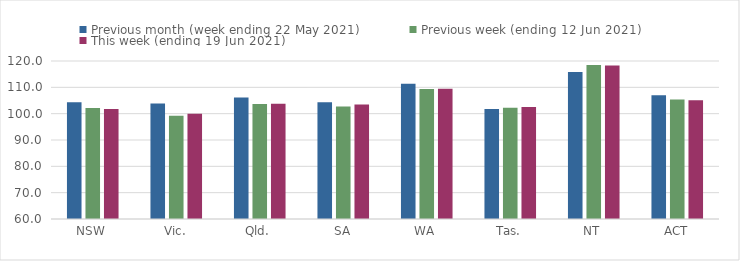
| Category | Previous month (week ending 22 May 2021) | Previous week (ending 12 Jun 2021) | This week (ending 19 Jun 2021) |
|---|---|---|---|
| NSW | 104.34 | 102.15 | 101.79 |
| Vic. | 103.86 | 99.23 | 99.99 |
| Qld. | 106.1 | 103.63 | 103.75 |
| SA | 104.38 | 102.7 | 103.47 |
| WA | 111.34 | 109.37 | 109.43 |
| Tas. | 101.77 | 102.22 | 102.49 |
| NT | 115.78 | 118.44 | 118.28 |
| ACT | 107.03 | 105.39 | 105.13 |